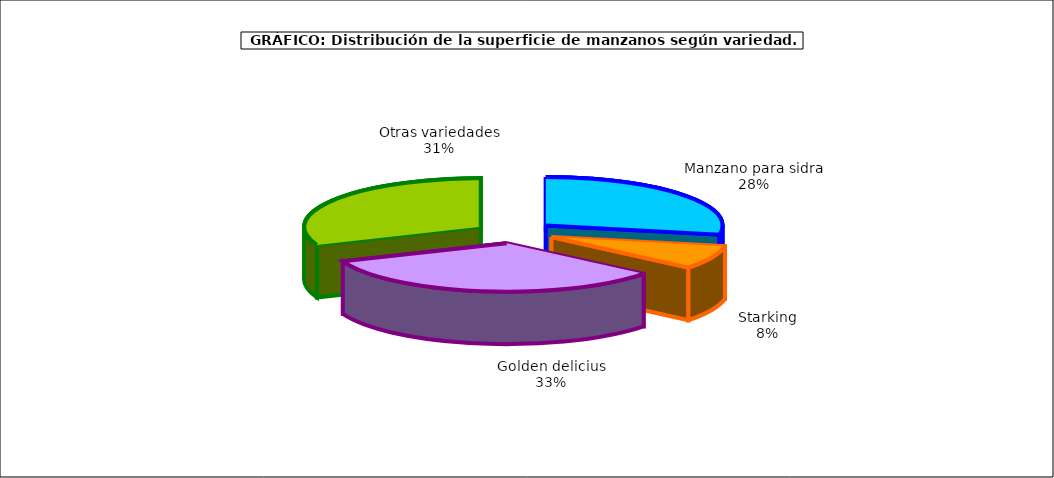
| Category | superficie |
|---|---|
| 0 | 8.312 |
| 1 | 2.327 |
| 2 | 9.777 |
| 3 | 9.221 |